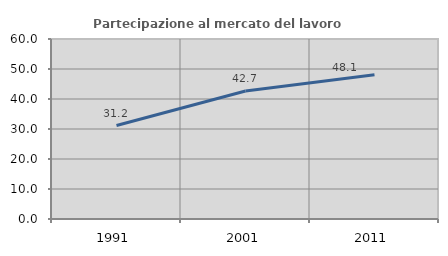
| Category | Partecipazione al mercato del lavoro  femminile |
|---|---|
| 1991.0 | 31.151 |
| 2001.0 | 42.687 |
| 2011.0 | 48.067 |